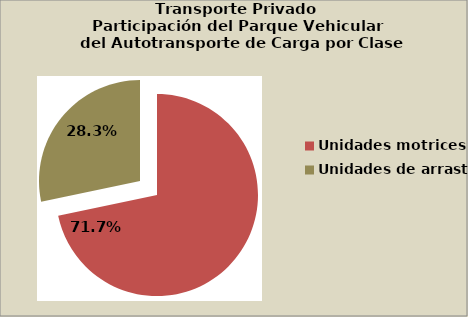
| Category | Series 0 |
|---|---|
| Unidades motrices | 71.672 |
| Unidades de arrastre | 28.281 |
| Grúas industriales | 0 |